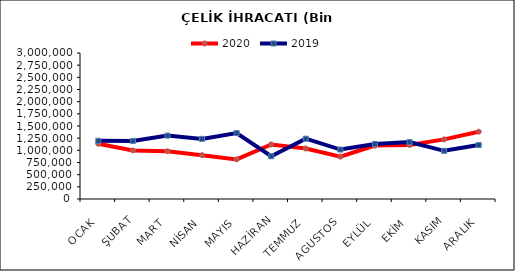
| Category | 2020 | 2019 |
|---|---|---|
| OCAK | 1135828.91 | 1195660.608 |
| ŞUBAT | 997635.787 | 1192860.68 |
| MART | 980858.603 | 1302279.675 |
| NİSAN | 901093.62 | 1235495.195 |
| MAYIS | 814297.159 | 1355647.401 |
| HAZİRAN | 1121122.889 | 877927.787 |
| TEMMUZ | 1036753.333 | 1239199.846 |
| AGUSTOS | 871219.898 | 1015932.963 |
| EYLÜL | 1097579.213 | 1131073.575 |
| EKİM | 1110615.98 | 1168915.11 |
| KASIM | 1224913.575 | 989897.142 |
| ARALIK | 1383259.956 | 1108324.477 |